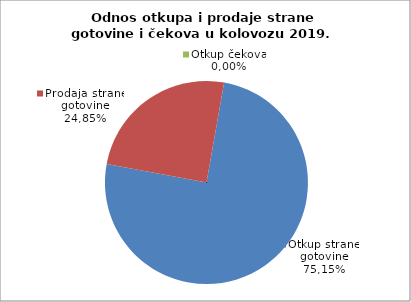
| Category | Otkup strane gotovine |
|---|---|
| 0 | 75.146 |
| 1 | 24.854 |
| 2 | 0 |